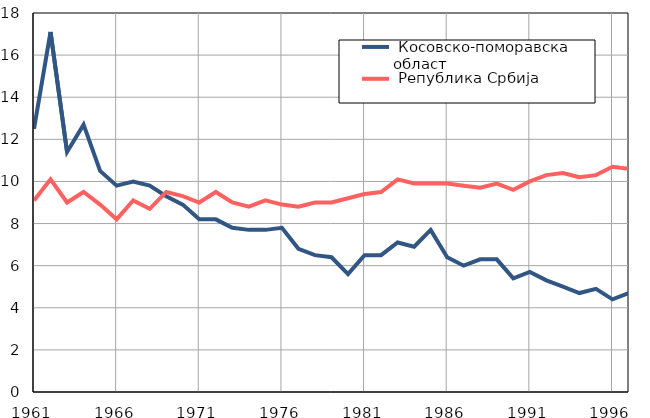
| Category |  Косовско-поморавска област |  Република Србија |
|---|---|---|
| 1961.0 | 12.5 | 9.1 |
| 1962.0 | 17.1 | 10.1 |
| 1963.0 | 11.4 | 9 |
| 1964.0 | 12.7 | 9.5 |
| 1965.0 | 10.5 | 8.9 |
| 1966.0 | 9.8 | 8.2 |
| 1967.0 | 10 | 9.1 |
| 1968.0 | 9.8 | 8.7 |
| 1969.0 | 9.3 | 9.5 |
| 1970.0 | 8.9 | 9.3 |
| 1971.0 | 8.2 | 9 |
| 1972.0 | 8.2 | 9.5 |
| 1973.0 | 7.8 | 9 |
| 1974.0 | 7.7 | 8.8 |
| 1975.0 | 7.7 | 9.1 |
| 1976.0 | 7.8 | 8.9 |
| 1977.0 | 6.8 | 8.8 |
| 1978.0 | 6.5 | 9 |
| 1979.0 | 6.4 | 9 |
| 1980.0 | 5.6 | 9.2 |
| 1981.0 | 6.5 | 9.4 |
| 1982.0 | 6.5 | 9.5 |
| 1983.0 | 7.1 | 10.1 |
| 1984.0 | 6.9 | 9.9 |
| 1985.0 | 7.7 | 9.9 |
| 1986.0 | 6.4 | 9.9 |
| 1987.0 | 6 | 9.8 |
| 1988.0 | 6.3 | 9.7 |
| 1989.0 | 6.3 | 9.9 |
| 1990.0 | 5.4 | 9.6 |
| 1991.0 | 5.7 | 10 |
| 1992.0 | 5.3 | 10.3 |
| 1993.0 | 5 | 10.4 |
| 1994.0 | 4.7 | 10.2 |
| 1995.0 | 4.9 | 10.3 |
| 1996.0 | 4.4 | 10.7 |
| 1997.0 | 4.7 | 10.6 |